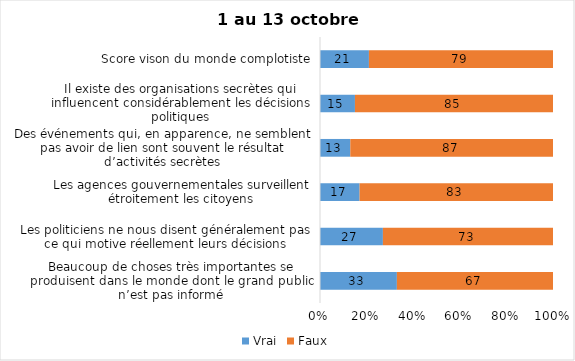
| Category | Vrai | Faux |
|---|---|---|
| Beaucoup de choses très importantes se produisent dans le monde dont le grand public n’est pas informé | 33 | 67 |
| Les politiciens ne nous disent généralement pas ce qui motive réellement leurs décisions | 27 | 73 |
| Les agences gouvernementales surveillent étroitement les citoyens | 17 | 83 |
| Des événements qui, en apparence, ne semblent pas avoir de lien sont souvent le résultat d’activités secrètes | 13 | 87 |
| Il existe des organisations secrètes qui influencent considérablement les décisions politiques | 15 | 85 |
| Score vison du monde complotiste | 21 | 79 |